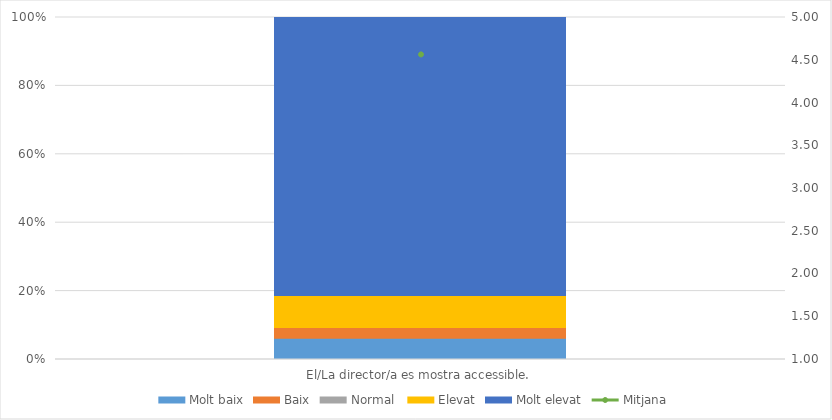
| Category | Molt baix | Baix | Normal  | Elevat | Molt elevat |
|---|---|---|---|---|---|
| El/La director/a es mostra accessible. | 2 | 1 | 0 | 3 | 26 |